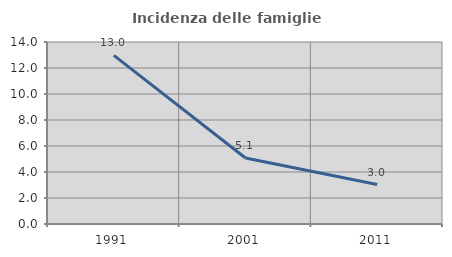
| Category | Incidenza delle famiglie numerose |
|---|---|
| 1991.0 | 12.966 |
| 2001.0 | 5.076 |
| 2011.0 | 3.037 |